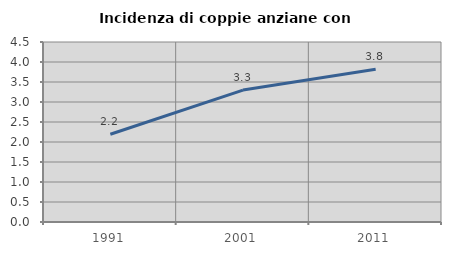
| Category | Incidenza di coppie anziane con figli |
|---|---|
| 1991.0 | 2.195 |
| 2001.0 | 3.298 |
| 2011.0 | 3.821 |